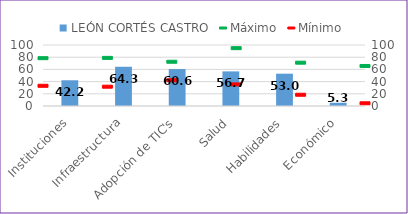
| Category | LEÓN CORTÉS CASTRO |
|---|---|
| Instituciones | 42.189 |
| Infraestructura | 64.32 |
| Adopción de TIC's | 60.608 |
| Salud | 56.743 |
| Habilidades | 52.957 |
| Económico | 5.259 |